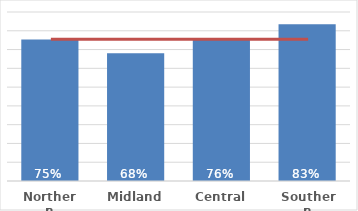
| Category | Total |
|---|---|
| Northern | 0.753 |
| Midland | 0.681 |
| Central | 0.761 |
| Southern | 0.835 |